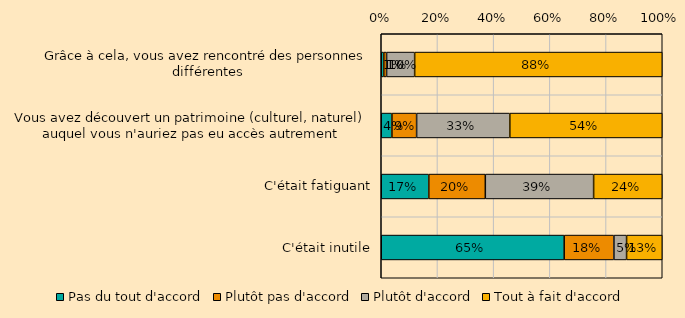
| Category | Pas du tout d'accord | Plutôt pas d'accord | Plutôt d'accord | Tout à fait d'accord |
|---|---|---|---|---|
| Grâce à cela, vous avez rencontré des personnes différentes | 0.009 | 0.01 | 0.1 | 0.882 |
| Vous avez découvert un patrimoine (culturel, naturel) auquel vous n'auriez pas eu accès autrement | 0.038 | 0.088 | 0.332 | 0.543 |
| C'était fatiguant | 0.169 | 0.201 | 0.385 | 0.244 |
| C'était inutile | 0.651 | 0.177 | 0.045 | 0.127 |